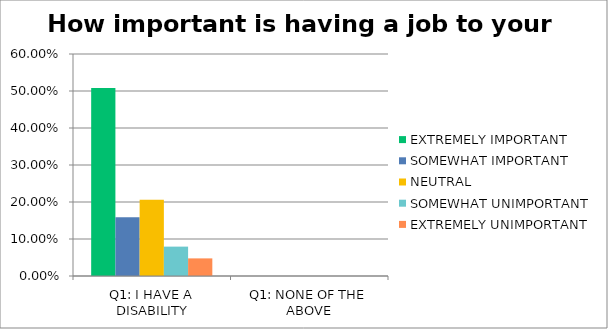
| Category | EXTREMELY IMPORTANT | SOMEWHAT IMPORTANT | NEUTRAL | SOMEWHAT UNIMPORTANT | EXTREMELY UNIMPORTANT |
|---|---|---|---|---|---|
| Q1: I HAVE A DISABILITY | 0.508 | 0.159 | 0.206 | 0.079 | 0.048 |
| Q1: NONE OF THE ABOVE | 0 | 0 | 0 | 0 | 0 |